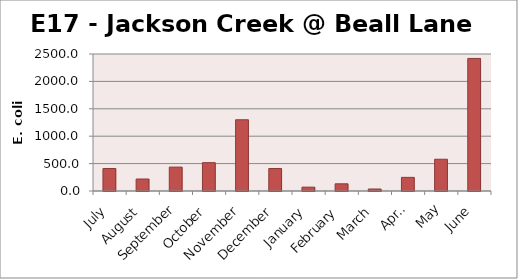
| Category | E. coli MPN |
|---|---|
| July | 410.6 |
| August | 218.7 |
| September | 436 |
| October | 517.2 |
| November | 1299.7 |
| December | 410.6 |
| January | 70.3 |
| February | 131.3 |
| March | 36.4 |
| April | 248.9 |
| May | 579.4 |
| June | 2419.2 |